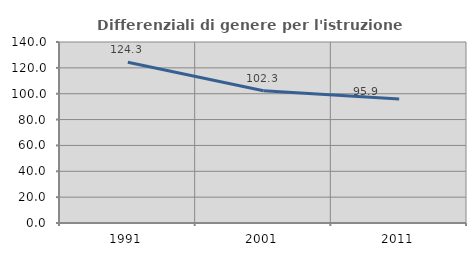
| Category | Differenziali di genere per l'istruzione superiore |
|---|---|
| 1991.0 | 124.27 |
| 2001.0 | 102.285 |
| 2011.0 | 95.941 |